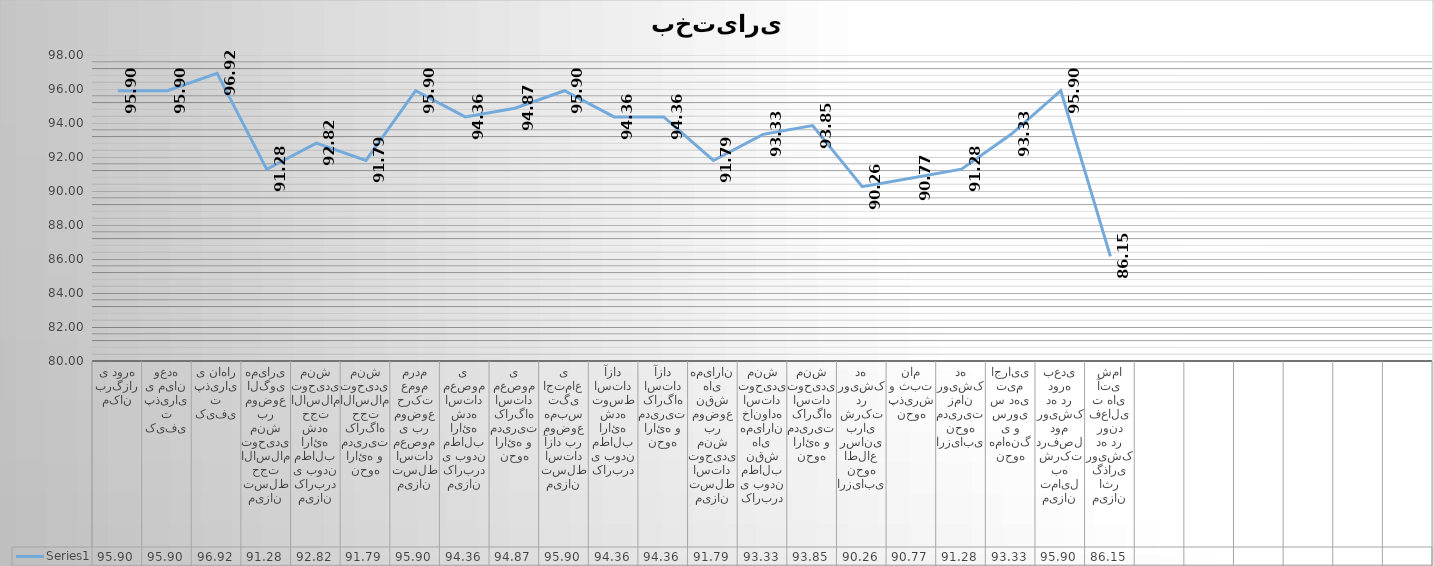
| Category | Series 0 |
|---|---|
| مکان برگزاری دوره | 95.897 |
| کیفیت پذیرایی میان وعده | 95.897 |
| کیفیت پذیرایی ناهار | 96.923 |
| میزان تسلط حجت الاسلام توحیدی منش بر موضوع الگوی همیاری | 91.282 |
| میزان کاربردی بودن مطالب ارائه شده حجت الاسلام توحیدی منش | 92.821 |
| نحوه ارائه و مدیریت کارگاه حجت الاسلام توحیدی منش | 91.795 |
| میزان تسلط استاد معصومی بر موضوع حرکت عموم مردم | 95.897 |
| میزان کاربردی بودن مطالب ارائه شده استاد معصومی  | 94.359 |
| نحوه ارائه و مدیریت کارگاه استاد معصومی | 94.872 |
| میزان تسلط استاد آزاد بر موضوع همبستگی اجتماعی | 95.897 |
| کاربردی بودن مطالب ارائه شده توسط استاد آزاد | 94.359 |
| نحوه ارائه و مدیریت کارگاه استاد آزاد | 94.359 |
| میزان تسلط استاد توحیدی منش بر موضوع نقش های همیاران | 91.795 |
| کاربردی بودن مطالب نقش های همیاران خانواده استاد توحیدی منش | 93.333 |
| نحوه ارائه و مدیریت کارگاه استاد توحیدی منش | 93.846 |
| ارزیابی نحوه اطلاع رسانی برای شرکت در رویشکده | 90.256 |
| نحوه پذیرش و ثبت نام | 90.769 |
| ارزیابی نحوه مدیریت زمان رویشکده | 91.282 |
| نحوه هماهنگی و سرویس دهی تیم اجرایی | 93.333 |
| میزان تمایل به شرکت درفصل دوم رویشکده در دوره بعدی | 95.897 |
| میزان اثر گذاری رویشکده در روند فعالیت های آتی شما | 86.154 |